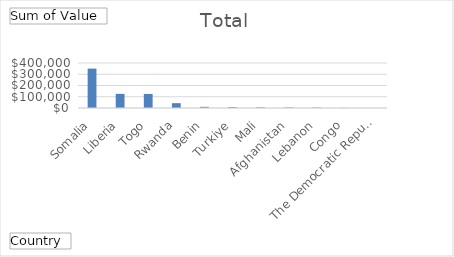
| Category | Total |
|---|---|
| Somalia | 350000 |
| Liberia | 125750 |
| Togo | 125000 |
| Rwanda | 42900 |
| Benin | 10200 |
| Turkiye | 7695 |
| Mali | 5587.93 |
| Afghanistan | 4310.5 |
| Lebanon | 3600 |
| Congo, The Democratic Republic | 1200 |
| Guyana | 0 |